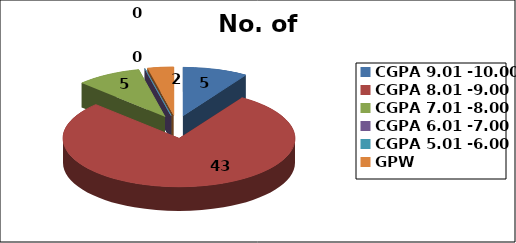
| Category | No. of Students |
|---|---|
| CGPA 9.01 -10.00 | 5 |
| CGPA 8.01 -9.00 | 43 |
| CGPA 7.01 -8.00 | 5 |
| CGPA 6.01 -7.00 | 0 |
| CGPA 5.01 -6.00 | 0 |
| GPW | 2 |